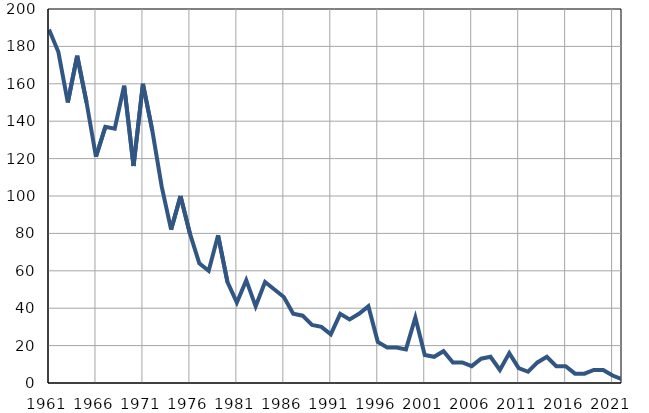
| Category | Умрла 
одојчад |
|---|---|
| 1961.0 | 189 |
| 1962.0 | 177 |
| 1963.0 | 150 |
| 1964.0 | 175 |
| 1965.0 | 150 |
| 1966.0 | 121 |
| 1967.0 | 137 |
| 1968.0 | 136 |
| 1969.0 | 159 |
| 1970.0 | 116 |
| 1971.0 | 160 |
| 1972.0 | 135 |
| 1973.0 | 105 |
| 1974.0 | 82 |
| 1975.0 | 100 |
| 1976.0 | 80 |
| 1977.0 | 64 |
| 1978.0 | 60 |
| 1979.0 | 79 |
| 1980.0 | 54 |
| 1981.0 | 43 |
| 1982.0 | 55 |
| 1983.0 | 41 |
| 1984.0 | 54 |
| 1985.0 | 50 |
| 1986.0 | 46 |
| 1987.0 | 37 |
| 1988.0 | 36 |
| 1989.0 | 31 |
| 1990.0 | 30 |
| 1991.0 | 26 |
| 1992.0 | 37 |
| 1993.0 | 34 |
| 1994.0 | 37 |
| 1995.0 | 41 |
| 1996.0 | 22 |
| 1997.0 | 19 |
| 1998.0 | 19 |
| 1999.0 | 18 |
| 2000.0 | 35 |
| 2001.0 | 15 |
| 2002.0 | 14 |
| 2003.0 | 17 |
| 2004.0 | 11 |
| 2005.0 | 11 |
| 2006.0 | 9 |
| 2007.0 | 13 |
| 2008.0 | 14 |
| 2009.0 | 7 |
| 2010.0 | 16 |
| 2011.0 | 8 |
| 2012.0 | 6 |
| 2013.0 | 11 |
| 2014.0 | 14 |
| 2015.0 | 9 |
| 2016.0 | 9 |
| 2017.0 | 5 |
| 2018.0 | 5 |
| 2019.0 | 7 |
| 2020.0 | 7 |
| 2021.0 | 4 |
| 2022.0 | 2 |